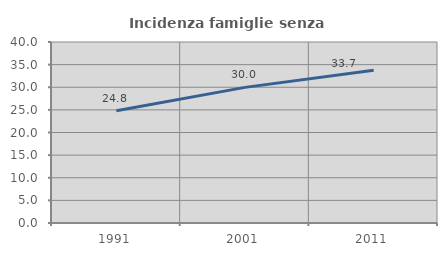
| Category | Incidenza famiglie senza nuclei |
|---|---|
| 1991.0 | 24.802 |
| 2001.0 | 29.972 |
| 2011.0 | 33.747 |